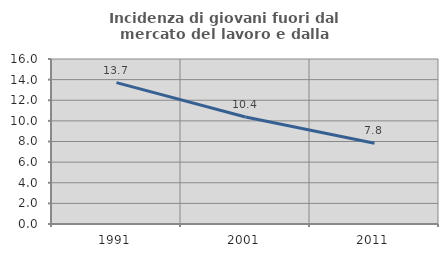
| Category | Incidenza di giovani fuori dal mercato del lavoro e dalla formazione  |
|---|---|
| 1991.0 | 13.713 |
| 2001.0 | 10.38 |
| 2011.0 | 7.824 |